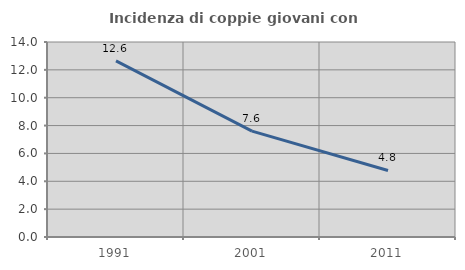
| Category | Incidenza di coppie giovani con figli |
|---|---|
| 1991.0 | 12.644 |
| 2001.0 | 7.604 |
| 2011.0 | 4.775 |